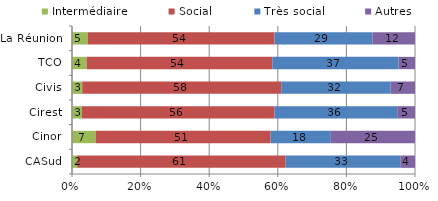
| Category | Intermédiaire | Social | Très social | Autres |
|---|---|---|---|---|
| CASud | 1.514 | 60.738 | 33.467 | 4.281 |
| Cinor | 6.886 | 51.016 | 17.566 | 24.533 |
| Cirest | 2.89 | 56.101 | 35.815 | 5.194 |
| Civis | 2.979 | 58.022 | 31.899 | 7.1 |
| TCO | 4.248 | 54.142 | 36.808 | 4.802 |
| La Réunion | 4.565 | 54.487 | 28.529 | 12.419 |